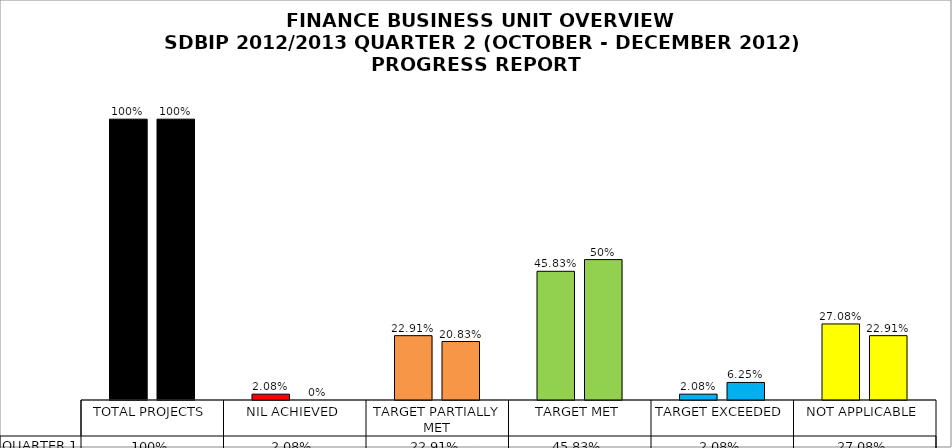
| Category | QUARTER 1 | QUARTER 2 |
|---|---|---|
| TOTAL PROJECTS | 1 | 1 |
| NIL ACHIEVED | 0.021 | 0 |
| TARGET PARTIALLY MET | 0.229 | 0.208 |
| TARGET MET | 0.458 | 0.5 |
| TARGET EXCEEDED | 0.021 | 0.062 |
| NOT APPLICABLE | 0.271 | 0.229 |